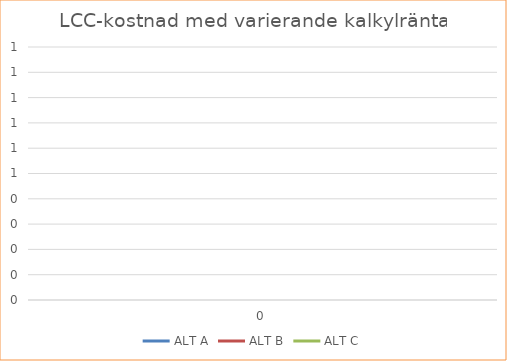
| Category | ALT A | ALT B | ALT C |
|---|---|---|---|
| 0.0 | 0 | 0 | 0 |
| 0.01 | 0 | 0 | 0 |
| 0.02 | 0 | 0 | 0 |
| 0.03 | 0 | 0 | 0 |
| 0.04 | 0 | 0 | 0 |
| 0.05 | 0 | 0 | 0 |
| 0.06 | 0 | 0 | 0 |
| 0.07 | 0 | 0 | 0 |
| 0.08 | 0 | 0 | 0 |
| 0.09 | 0 | 0 | 0 |
| 0.1 | 0 | 0 | 0 |
| 0.11 | 0 | 0 | 0 |
| 0.12 | 0 | 0 | 0 |
| 0.13 | 0 | 0 | 0 |
| 0.14 | 0 | 0 | 0 |
| 0.15 | 0 | 0 | 0 |